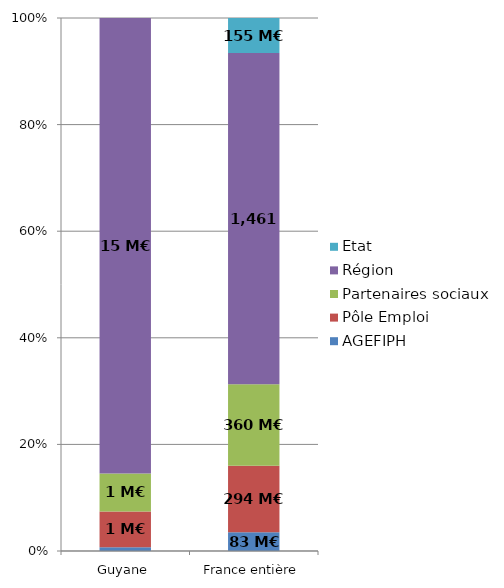
| Category | AGEFIPH | Pôle Emploi | Partenaires sociaux | Région | Etat |
|---|---|---|---|---|---|
| Guyane | 0.128 | 1.212 | 1.3 | 15.49 | 0 |
| France entière | 82.716 | 293.959 | 359.593 | 1461.057 | 154.74 |